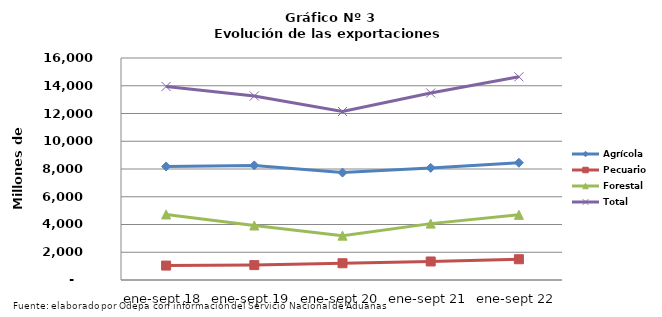
| Category | Agrícola | Pecuario | Forestal | Total |
|---|---|---|---|---|
| ene-sept 18 | 8182409 | 1039856 | 4724575 | 13946840 |
| ene-sept 19 | 8260611 | 1072396 | 3927427 | 13260434 |
| ene-sept 20 | 7740397 | 1207962 | 3195291 | 12143650 |
| ene-sept 21 | 8080241 | 1335562 | 4063650 | 13479453 |
| ene-sept 22 | 8450594 | 1495755 | 4697919 | 14644268 |